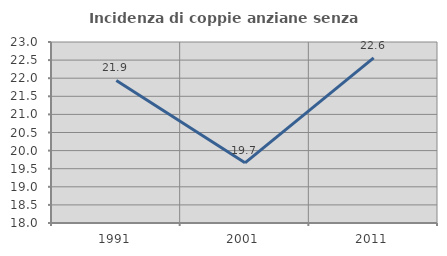
| Category | Incidenza di coppie anziane senza figli  |
|---|---|
| 1991.0 | 21.939 |
| 2001.0 | 19.663 |
| 2011.0 | 22.561 |